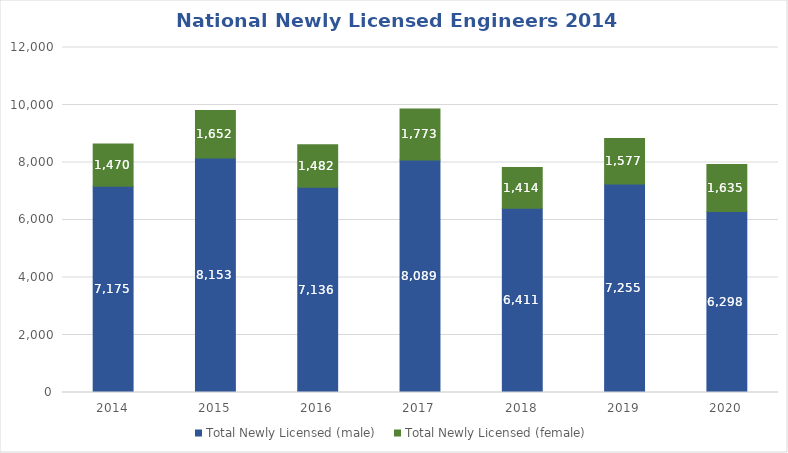
| Category | Total Newly Licensed (male) | Total Newly Licensed (female) |
|---|---|---|
| 2014.0 | 7175 | 1470 |
| 2015.0 | 8153 | 1652 |
| 2016.0 | 7136 | 1482 |
| 2017.0 | 8089 | 1773 |
| 2018.0 | 6411 | 1414 |
| 2019.0 | 7255 | 1577 |
| 2020.0 | 6298 | 1635 |